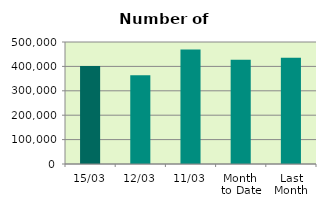
| Category | Series 0 |
|---|---|
| 15/03 | 401470 |
| 12/03 | 363658 |
| 11/03 | 469466 |
| Month 
to Date | 427246.364 |
| Last
Month | 435925.8 |